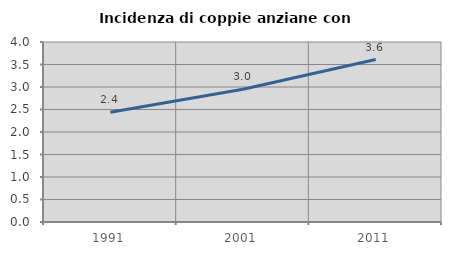
| Category | Incidenza di coppie anziane con figli |
|---|---|
| 1991.0 | 2.438 |
| 2001.0 | 2.951 |
| 2011.0 | 3.609 |